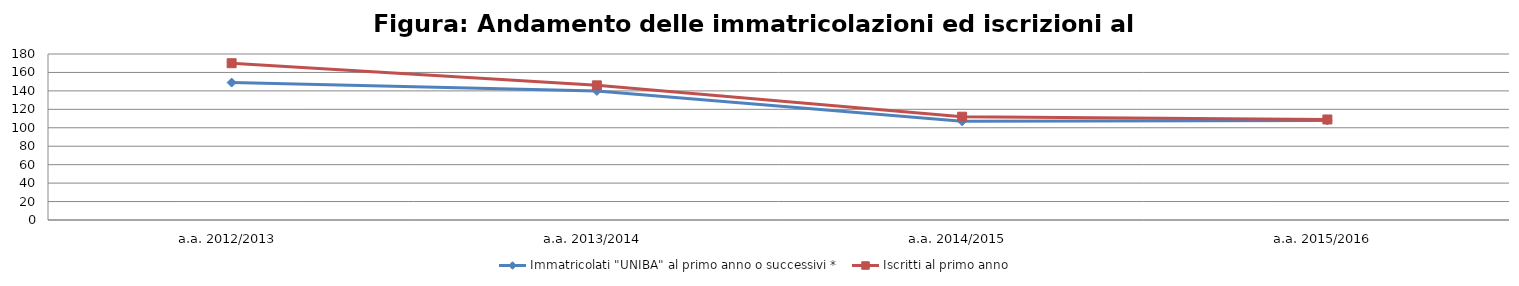
| Category | Immatricolati "UNIBA" al primo anno o successivi * | Iscritti al primo anno  |
|---|---|---|
| a.a. 2012/2013 | 149 | 170 |
| a.a. 2013/2014 | 140 | 146 |
| a.a. 2014/2015 | 107 | 112 |
| a.a. 2015/2016 | 108 | 109 |